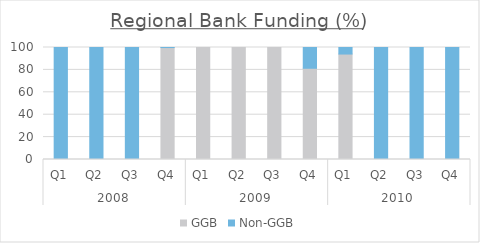
| Category | GGB | Non-GGB |
|---|---|---|
| 0 | 0 | 100 |
| 1 | 0 | 100 |
| 2 | 0 | 100 |
| 3 | 99.953 | 0.047 |
| 4 | 100 | 0 |
| 5 | 100 | 0 |
| 6 | 100 | 0 |
| 7 | 81.46 | 18.54 |
| 8 | 94.162 | 5.838 |
| 9 | 0 | 100 |
| 10 | 0 | 100 |
| 11 | 0 | 100 |